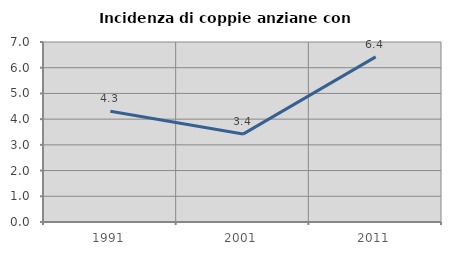
| Category | Incidenza di coppie anziane con figli |
|---|---|
| 1991.0 | 4.31 |
| 2001.0 | 3.419 |
| 2011.0 | 6.422 |